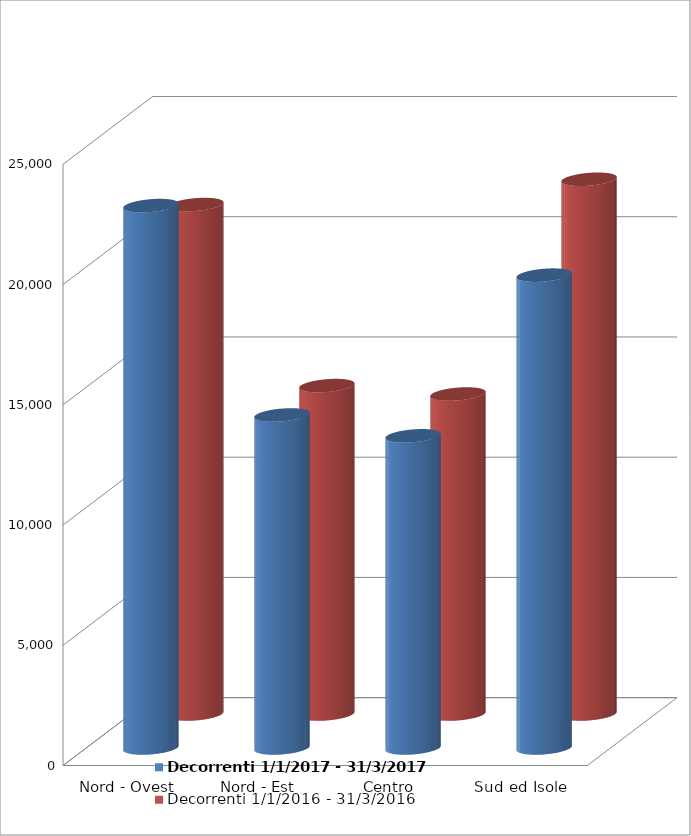
| Category | Decorrenti 1/1/2017 - 31/3/2017 | Decorrenti 1/1/2016 - 31/3/2016 |
|---|---|---|
| Nord - Ovest | 22554 | 21187 |
| Nord - Est | 13847 | 13658 |
| Centro | 12981 | 13309 |
| Sud ed Isole | 19662 | 22238 |